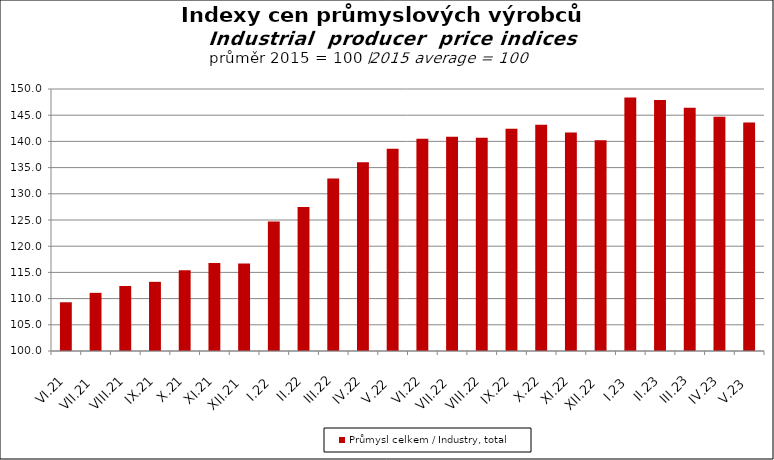
| Category | Průmysl celkem / Industry, total |
|---|---|
| VI.21 | 109.3 |
| VII.21 | 111.1 |
| VIII.21 | 112.4 |
| IX.21 | 113.2 |
| X.21 | 115.4 |
| XI.21 | 116.8 |
| XII.21 | 116.7 |
| I.22 | 124.7 |
| II.22 | 127.5 |
| III.22 | 132.9 |
| IV.22 | 136 |
| V.22 | 138.6 |
| VI.22 | 140.5 |
| VII.22 | 140.9 |
| VIII.22 | 140.7 |
| IX.22 | 142.4 |
| X.22 | 143.2 |
| XI.22 | 141.7 |
| XII.22 | 140.2 |
| I.23 | 148.4 |
| II.23 | 147.9 |
| III.23 | 146.4 |
| IV.23 | 144.7 |
| V.23 | 143.6 |